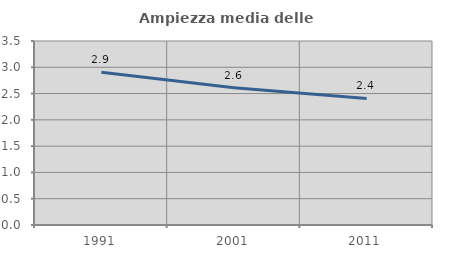
| Category | Ampiezza media delle famiglie |
|---|---|
| 1991.0 | 2.904 |
| 2001.0 | 2.609 |
| 2011.0 | 2.406 |